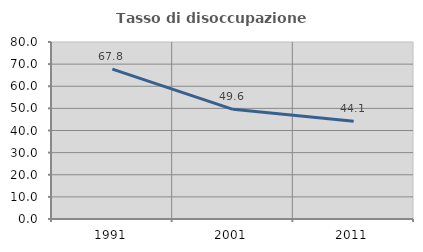
| Category | Tasso di disoccupazione giovanile  |
|---|---|
| 1991.0 | 67.754 |
| 2001.0 | 49.573 |
| 2011.0 | 44.149 |